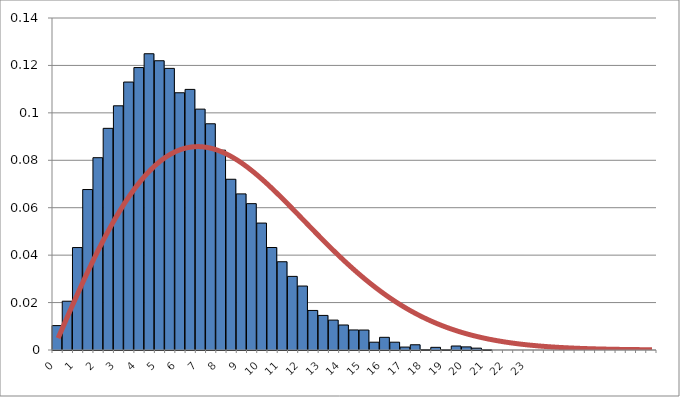
| Category | Series 0 |
|---|---|
| 0.0 | 0.01 |
| 0.5 | 0.021 |
| 1.0 | 0.043 |
| 1.5 | 0.068 |
| 2.0 | 0.081 |
| 2.5 | 0.093 |
| 3.0 | 0.103 |
| 3.5 | 0.113 |
| 4.0 | 0.119 |
| 4.5 | 0.125 |
| 5.0 | 0.122 |
| 5.5 | 0.119 |
| 6.0 | 0.108 |
| 6.5 | 0.11 |
| 7.0 | 0.102 |
| 7.5 | 0.095 |
| 8.0 | 0.084 |
| 8.5 | 0.072 |
| 9.0 | 0.066 |
| 9.5 | 0.062 |
| 10.0 | 0.054 |
| 10.5 | 0.043 |
| 11.0 | 0.037 |
| 11.5 | 0.031 |
| 12.0 | 0.027 |
| 12.5 | 0.017 |
| 13.0 | 0.015 |
| 13.5 | 0.013 |
| 14.0 | 0.011 |
| 14.5 | 0.008 |
| 15.0 | 0.008 |
| 15.5 | 0.003 |
| 16.0 | 0.005 |
| 16.5 | 0.003 |
| 17.0 | 0.001 |
| 17.5 | 0.002 |
| 18.0 | 0 |
| 18.5 | 0.001 |
| 19.0 | 0 |
| 19.5 | 0.002 |
| 20.0 | 0.001 |
| 20.5 | 0.001 |
| 21.0 | 0 |
| 21.5 | 0 |
| 22.0 | 0 |
| 22.5 | 0 |
| 23.0 | 0 |
| 23.5 | 0 |